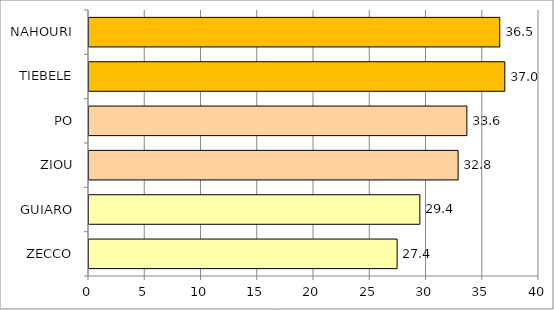
| Category | Series 0 |
|---|---|
| ZECCO | 27.39 |
| GUIARO | 29.41 |
| ZIOU | 32.81 |
| PO | 33.59 |
| TIEBELE | 36.96 |
| NAHOURI | 36.511 |